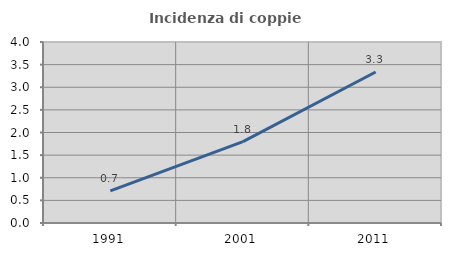
| Category | Incidenza di coppie miste |
|---|---|
| 1991.0 | 0.71 |
| 2001.0 | 1.799 |
| 2011.0 | 3.336 |